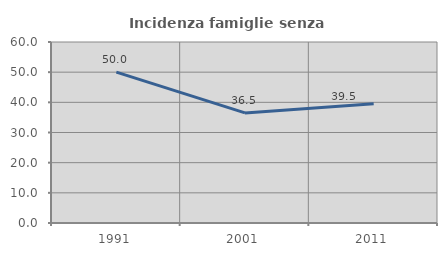
| Category | Incidenza famiglie senza nuclei |
|---|---|
| 1991.0 | 50 |
| 2001.0 | 36.486 |
| 2011.0 | 39.535 |